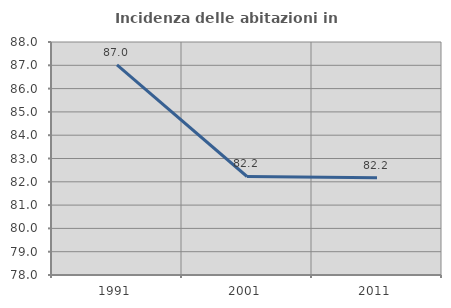
| Category | Incidenza delle abitazioni in proprietà  |
|---|---|
| 1991.0 | 87.015 |
| 2001.0 | 82.227 |
| 2011.0 | 82.169 |